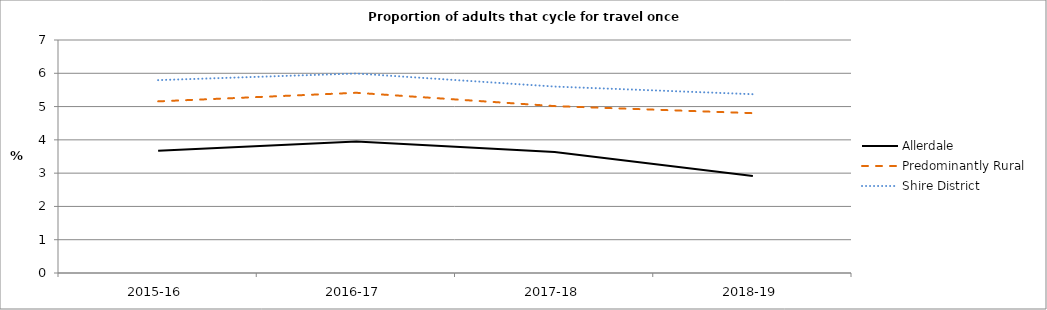
| Category | Allerdale | Predominantly Rural | Shire District |
|---|---|---|---|
| 2015-16 | 3.673 | 5.156 | 5.794 |
| 2016-17 | 3.954 | 5.414 | 5.993 |
| 2017-18 | 3.635 | 5.014 | 5.601 |
| 2018-19 | 2.913 | 4.801 | 5.371 |